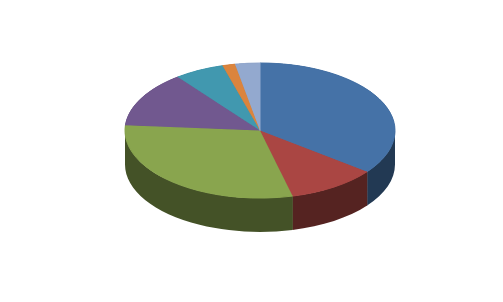
| Category | Series 0 |
|---|---|
| Soybeans & Products | 0.354 |
| Corn | 0.107 |
| Meat & Animals | 0.301 |
| Feeds & Fodder | 0.133 |
| Grain Products | 0.06 |
| Dairy Products | 0.015 |
| Other | 0.03 |